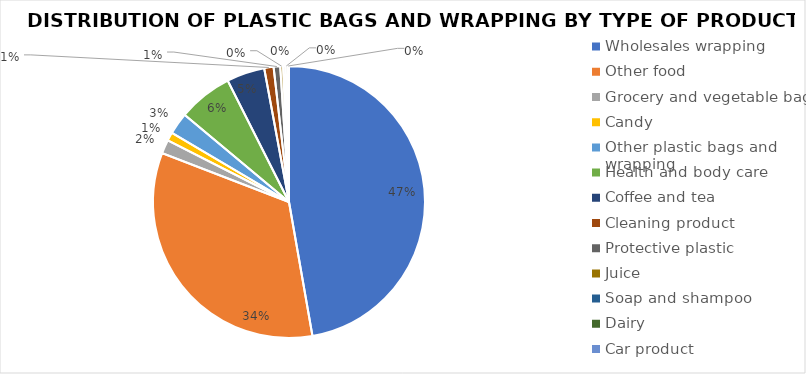
| Category | Series 1 |
|---|---|
| Wholesales wrapping | 82.11 |
| Other food | 58.436 |
| Grocery and vegetable bags | 2.815 |
| Candy | 1.773 |
| Other plastic bags and wrapping | 4.474 |
| Health and body care | 11.279 |
| Coffee and tea | 7.848 |
| Cleaning product | 1.934 |
| Protective plastic | 1.36 |
| Juice | 0.584 |
| Soap and shampoo | 0.438 |
| Dairy | 0.438 |
| Car product | 0.328 |